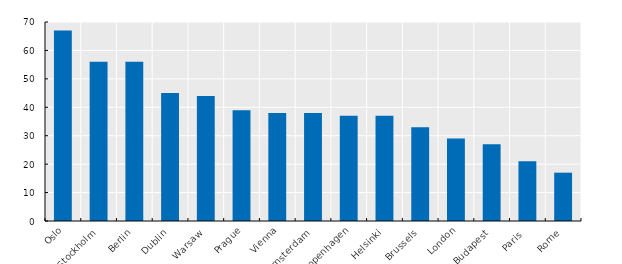
| Category | 2014, % |
|---|---|
| Rome | 17 |
| Paris  | 21 |
| Budapest | 27 |
| London | 29 |
| Brussels | 33 |
| Helsinki | 37 |
| Copenhagen | 37 |
| Amsterdam | 38 |
| Vienna | 38 |
| Prague | 39 |
| Warsaw | 44 |
| Dublin | 45 |
| Berlin | 56 |
| Stockholm | 56 |
| Oslo | 67 |